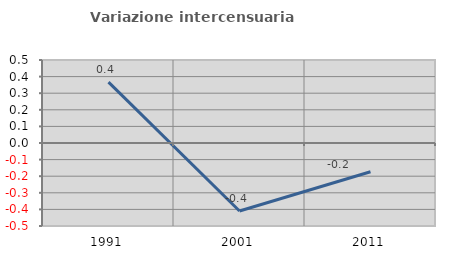
| Category | Variazione intercensuaria annua |
|---|---|
| 1991.0 | 0.367 |
| 2001.0 | -0.41 |
| 2011.0 | -0.173 |